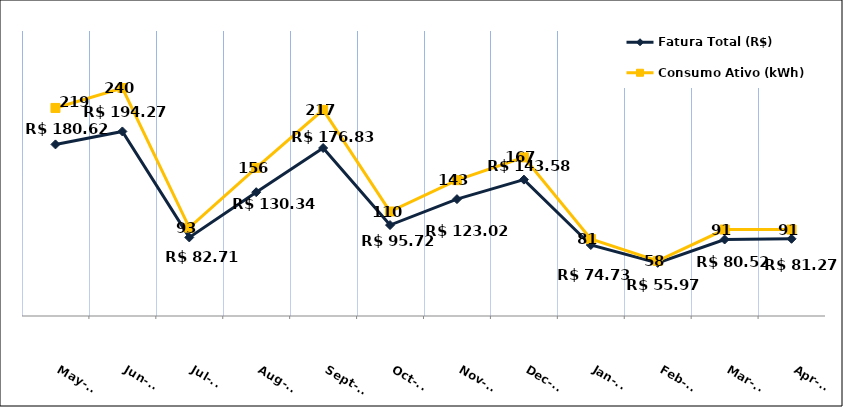
| Category | Fatura Total (R$) |
|---|---|
| 2023-05-01 | 180.62 |
| 2023-06-01 | 194.27 |
| 2023-07-01 | 82.71 |
| 2023-08-01 | 130.34 |
| 2023-09-01 | 176.83 |
| 2023-10-01 | 95.72 |
| 2023-11-01 | 123.02 |
| 2023-12-01 | 143.58 |
| 2024-01-01 | 74.73 |
| 2024-02-01 | 55.97 |
| 2024-03-01 | 80.52 |
| 2024-04-01 | 81.27 |